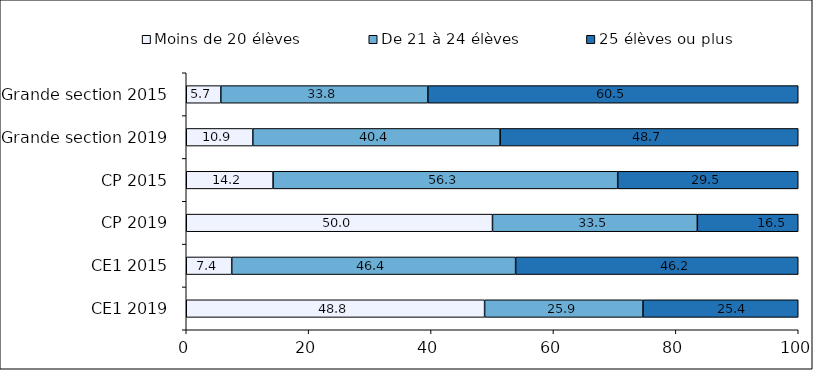
| Category | Moins de 20 élèves | De 21 à 24 élèves | 25 élèves ou plus |
|---|---|---|---|
| CE1 2019 | 48.75 | 25.88 | 25.37 |
| CE1 2015 | 7.43 | 46.39 | 46.18 |
| CP 2019 | 50.04 | 33.47 | 16.49 |
| CP 2015 | 14.19 | 56.31 | 29.5 |
| Grande section 2019 | 10.88 | 40.41 | 48.71 |
| Grande section 2015 | 5.65 | 33.83 | 60.52 |